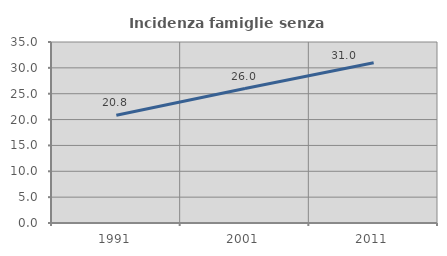
| Category | Incidenza famiglie senza nuclei |
|---|---|
| 1991.0 | 20.829 |
| 2001.0 | 25.997 |
| 2011.0 | 30.999 |